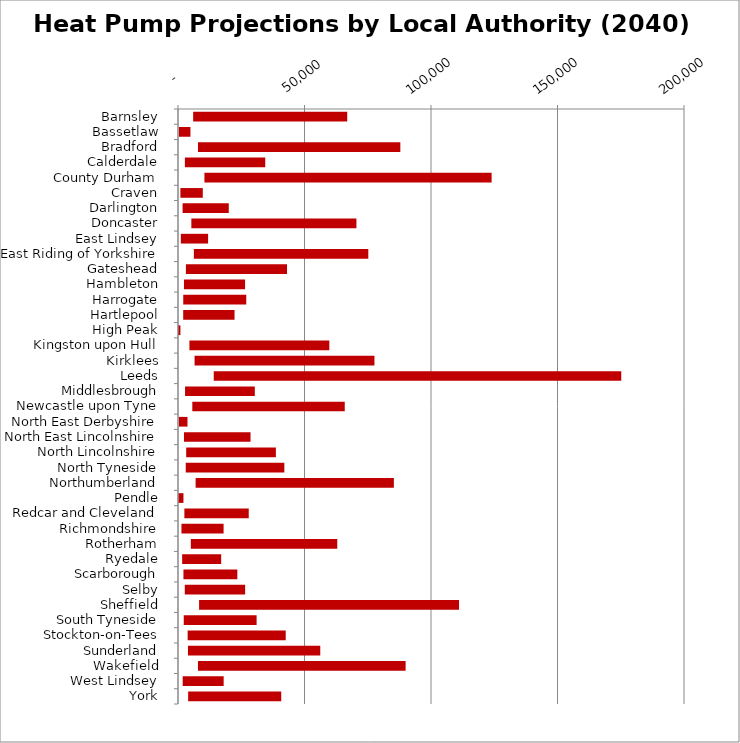
| Category | MIN | MAX |
|---|---|---|
| Barnsley | 5986 | 60899 |
| Bassetlaw | 368 | 4554 |
| Bradford | 7905 | 79973 |
| Calderdale | 2723 | 31761 |
| County Durham | 10445 | 113513 |
| Craven | 948 | 8852 |
| Darlington | 1814 | 18259 |
| Doncaster | 5277 | 65248 |
| East Lindsey | 1123 | 10775 |
| East Riding of Yorkshire | 6264 | 68956 |
| Gateshead | 3123 | 39967 |
| Hambleton | 2360 | 24147 |
| Harrogate | 2079 | 24907 |
| Hartlepool | 2055 | 20294 |
| High Peak | 75 | 882 |
| Kingston upon Hull | 4515 | 55297 |
| Kirklees | 6548 | 71101 |
| Leeds | 14129 | 161078 |
| Middlesbrough | 2793 | 27565 |
| Newcastle upon Tyne | 5656 | 60254 |
| North East Derbyshire | 351 | 3399 |
| North East Lincolnshire | 2359 | 26305 |
| North Lincolnshire | 3234 | 35455 |
| North Tyneside | 3060 | 38967 |
| Northumberland | 6962 | 78364 |
| Pendle | 162 | 1995 |
| Redcar and Cleveland | 2518 | 25446 |
| Richmondshire | 1368 | 16653 |
| Rotherham | 5062 | 57888 |
| Ryedale | 1644 | 15424 |
| Scarborough | 2151 | 21305 |
| Selby | 2679 | 23858 |
| Sheffield | 8335 | 102743 |
| South Tyneside | 2273 | 28799 |
| Stockton-on-Tees | 3813 | 38764 |
| Sunderland | 3936 | 52295 |
| Wakefield | 7888 | 82079 |
| West Lindsey | 1850 | 16197 |
| York | 4009 | 36795 |